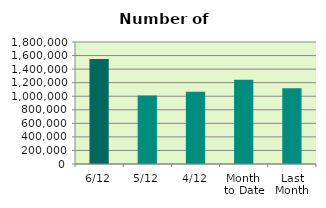
| Category | Series 0 |
|---|---|
| 6/12 | 1550892 |
| 5/12 | 1011092 |
| 4/12 | 1065582 |
| Month 
to Date | 1243890.5 |
| Last
Month | 1117514.364 |